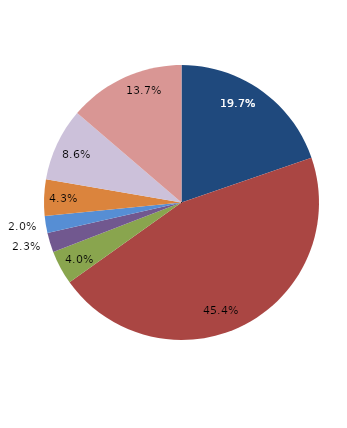
| Category | Series 0 |
|---|---|
| قبل الدخول | 19.714 |
| -1 | 45.429 |
| 1 | 4 |
| 2 | 2.286 |
| 3 | 2 |
| 4 | 4.286 |
|  5 - 9 | 8.571 |
| 10 - 14 | 13.714 |